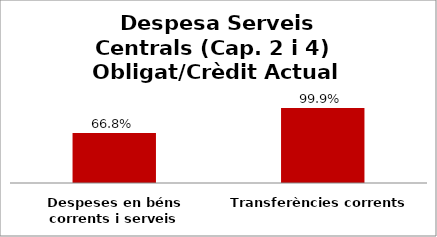
| Category | Series 0 |
|---|---|
| Despeses en béns corrents i serveis | 0.668 |
| Transferències corrents | 0.999 |